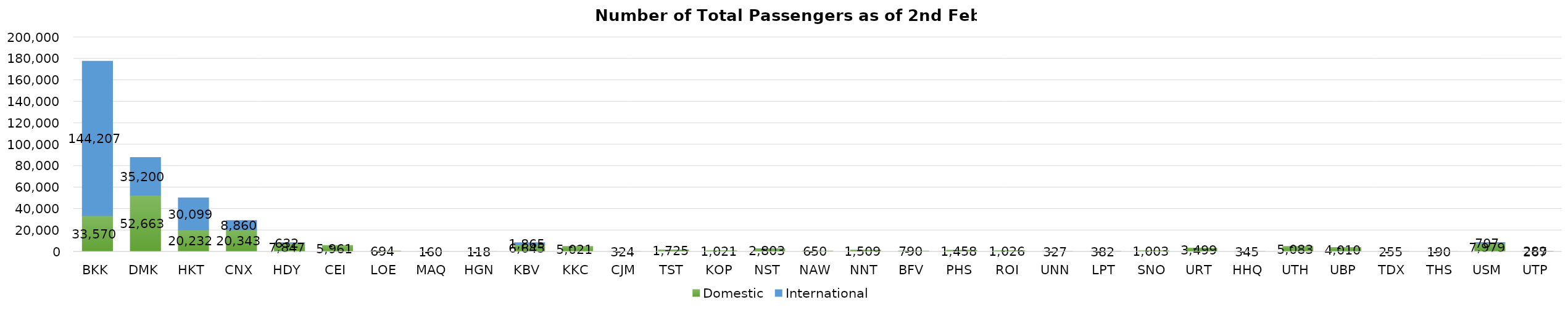
| Category | Domestic | International |
|---|---|---|
| BKK | 33570 | 144207 |
| DMK | 52663 | 35200 |
| HKT | 20232 | 30099 |
| CNX | 20343 | 8860 |
| HDY | 7847 | 632 |
| CEI | 5961 | 0 |
| LOE | 694 | 0 |
| MAQ | 160 | 0 |
| HGN | 118 | 0 |
| KBV | 6645 | 1865 |
| KKC | 5021 | 0 |
| CJM | 324 | 0 |
| TST | 1725 | 0 |
| KOP | 1021 | 0 |
| NST | 2803 | 0 |
| NAW | 650 | 0 |
| NNT | 1509 | 0 |
| BFV | 790 | 0 |
| PHS | 1458 | 0 |
| ROI | 1026 | 0 |
| UNN | 327 | 0 |
| LPT | 382 | 0 |
| SNO | 1003 | 0 |
| URT | 3499 | 0 |
| HHQ | 345 | 0 |
| UTH | 5083 | 0 |
| UBP | 4010 | 0 |
| TDX | 255 | 0 |
| THS | 190 | 0 |
| USM | 7979 | 707 |
| UTP | 267 | 289 |